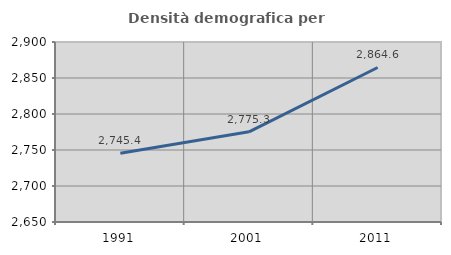
| Category | Densità demografica |
|---|---|
| 1991.0 | 2745.359 |
| 2001.0 | 2775.286 |
| 2011.0 | 2864.605 |